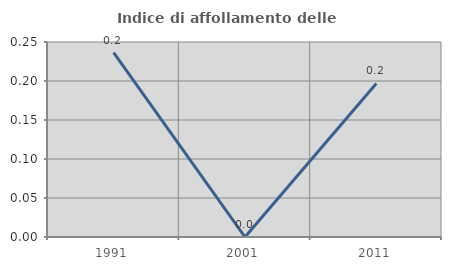
| Category | Indice di affollamento delle abitazioni  |
|---|---|
| 1991.0 | 0.236 |
| 2001.0 | 0 |
| 2011.0 | 0.197 |